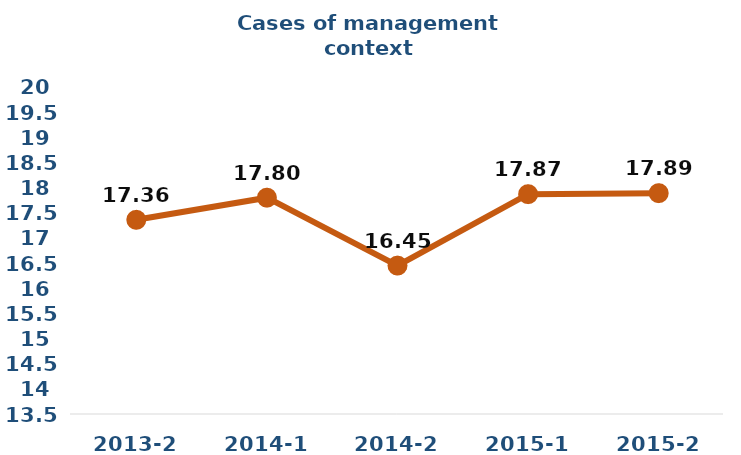
| Category | Series 0 |
|---|---|
| 2013-2 | 17.36 |
| 2014-1 | 17.8 |
| 2014-2 | 16.45 |
| 2015-1 | 17.87 |
| 2015-2 | 17.89 |